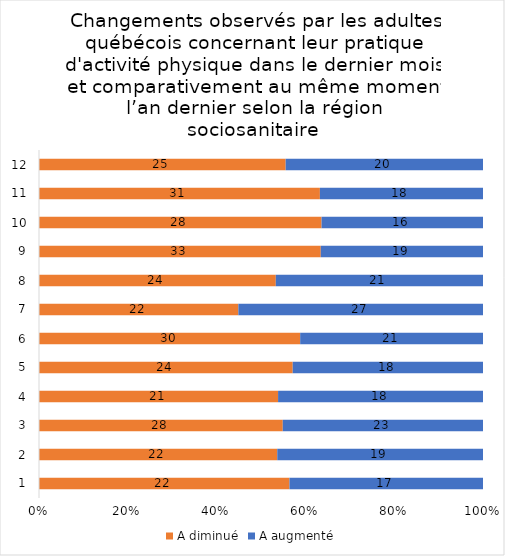
| Category | A diminué | A augmenté |
|---|---|---|
| 0 | 22 | 17 |
| 1 | 22 | 19 |
| 2 | 28 | 23 |
| 3 | 21 | 18 |
| 4 | 24 | 18 |
| 5 | 30 | 21 |
| 6 | 22 | 27 |
| 7 | 24 | 21 |
| 8 | 33 | 19 |
| 9 | 28 | 16 |
| 10 | 31 | 18 |
| 11 | 25 | 20 |